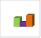
| Category | област Кюстендил |
|---|---|
| летен сезон 2019  | 81922 |
| летен сезон 2021  | 72815 |
| летен сезон 2022 г.  | 86721 |